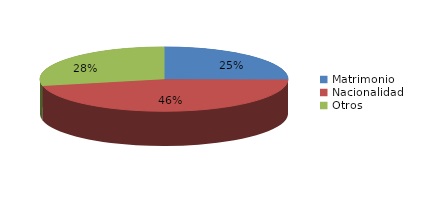
| Category | Series 0 |
|---|---|
| Matrimonio | 1475 |
| Nacionalidad | 2711 |
| Otros | 1661 |